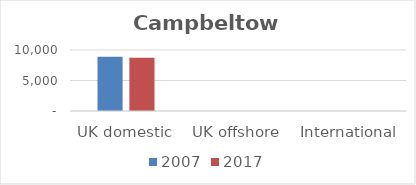
| Category | 2007 | 2017 |
|---|---|---|
| UK domestic | 8876 | 8726 |
| UK offshore | 0 | 0 |
| International | 0 | 0 |